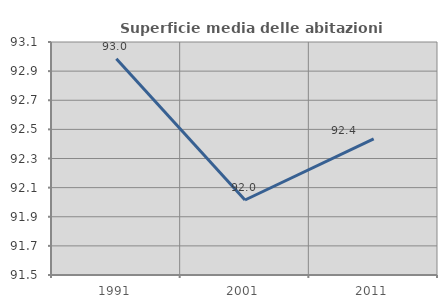
| Category | Superficie media delle abitazioni occupate |
|---|---|
| 1991.0 | 92.985 |
| 2001.0 | 92.015 |
| 2011.0 | 92.434 |